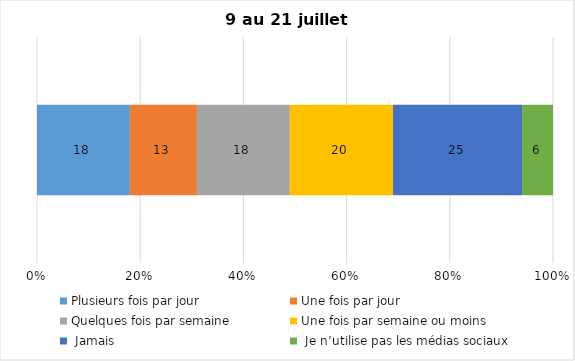
| Category | Plusieurs fois par jour | Une fois par jour | Quelques fois par semaine   | Une fois par semaine ou moins   |  Jamais   |  Je n’utilise pas les médias sociaux |
|---|---|---|---|---|---|---|
| 0 | 18 | 13 | 18 | 20 | 25 | 6 |